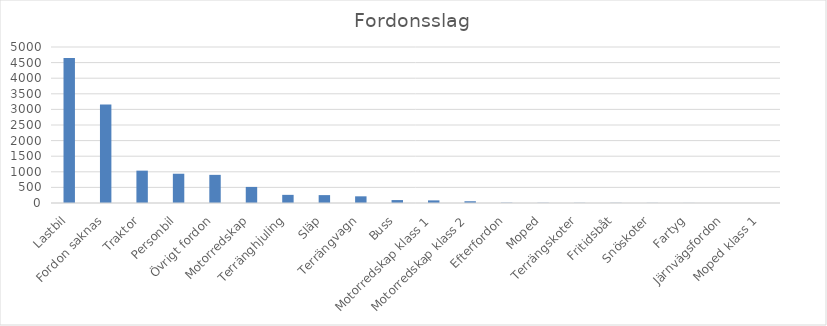
| Category | Summa |
|---|---|
| Lastbil | 4648 |
| Fordon saknas | 3154 |
| Traktor | 1037 |
| Personbil | 938 |
| Övrigt fordon | 902 |
| Motorredskap | 515 |
| Terränghjuling | 261 |
| Släp | 253 |
| Terrängvagn | 214 |
| Buss | 94 |
| Motorredskap klass 1 | 84 |
| Motorredskap klass 2 | 56 |
| Efterfordon | 9 |
| Moped | 6 |
| Terrängskoter | 5 |
| Fritidsbåt | 5 |
| Snöskoter | 4 |
| Fartyg | 2 |
| Järnvägsfordon | 1 |
| Moped klass 1 | 1 |